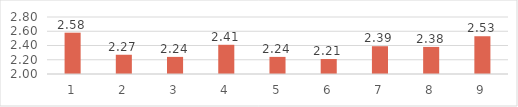
| Category | Series 0 |
|---|---|
| 0 | 2.58 |
| 1 | 2.27 |
| 2 | 2.24 |
| 3 | 2.41 |
| 4 | 2.24 |
| 5 | 2.21 |
| 6 | 2.39 |
| 7 | 2.38 |
| 8 | 2.53 |